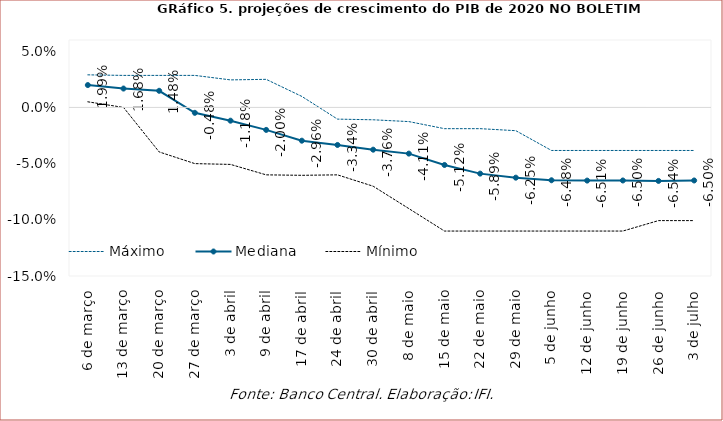
| Category | Máximo | Mediana | Mínimo |
|---|---|---|---|
| 6 de março | 0.029 | 0.02 | 0.005 |
| 13 de março | 0.028 | 0.017 | 0 |
| 20 de março | 0.028 | 0.015 | -0.04 |
| 27 de março | 0.028 | -0.005 | -0.05 |
| 3 de abril | 0.024 | -0.012 | -0.051 |
| 9 de abril | 0.025 | -0.02 | -0.06 |
| 17 de abril | 0.01 | -0.03 | -0.06 |
| 24 de abril | -0.01 | -0.033 | -0.06 |
| 30 de abril | -0.011 | -0.038 | -0.07 |
| 8 de maio | -0.013 | -0.041 | -0.09 |
| 15 de maio | -0.019 | -0.051 | -0.11 |
| 22 de maio | -0.019 | -0.059 | -0.11 |
| 29 de maio | -0.021 | -0.062 | -0.11 |
| 5 de junho | -0.038 | -0.065 | -0.11 |
| 12 de junho | -0.038 | -0.065 | -0.11 |
| 19 de junho | -0.038 | -0.065 | -0.11 |
| 26 de junho | -0.038 | -0.065 | -0.101 |
| 3 de julho | -0.038 | -0.065 | -0.101 |